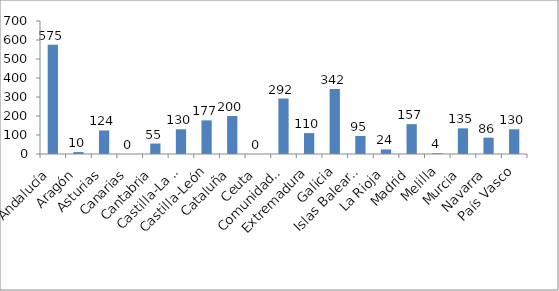
| Category | Series 0 |
|---|---|
| Andalucía | 575 |
| Aragón | 10 |
| Asturias | 124 |
| Canarias | 0 |
| Cantabria | 55 |
| Castilla-La Mancha | 130 |
| Castilla-León | 177 |
| Cataluña | 200 |
| Ceuta | 0 |
| Comunidad Valenciana | 292 |
| Extremadura | 110 |
| Galicia | 342 |
| Islas Baleares | 95 |
| La Rioja | 24 |
| Madrid | 157 |
| Melilla | 4 |
| Murcia | 135 |
| Navarra | 86 |
| País Vasco | 130 |